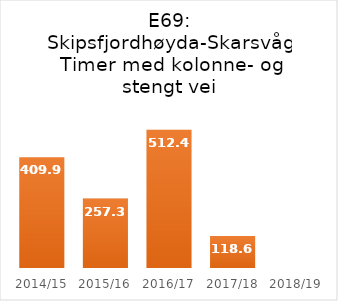
| Category | TOTTID |
|---|---|
| 2014/15 | 409.9 |
| 2015/16 | 257.3 |
| 2016/17 | 512.4 |
| 2017/18 | 118.6 |
| 2018/19 | 0 |